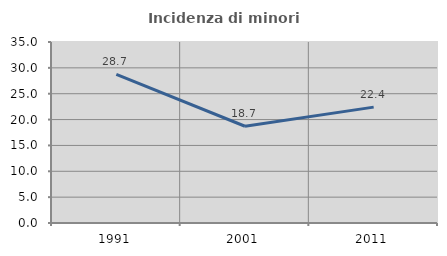
| Category | Incidenza di minori stranieri |
|---|---|
| 1991.0 | 28.723 |
| 2001.0 | 18.708 |
| 2011.0 | 22.407 |